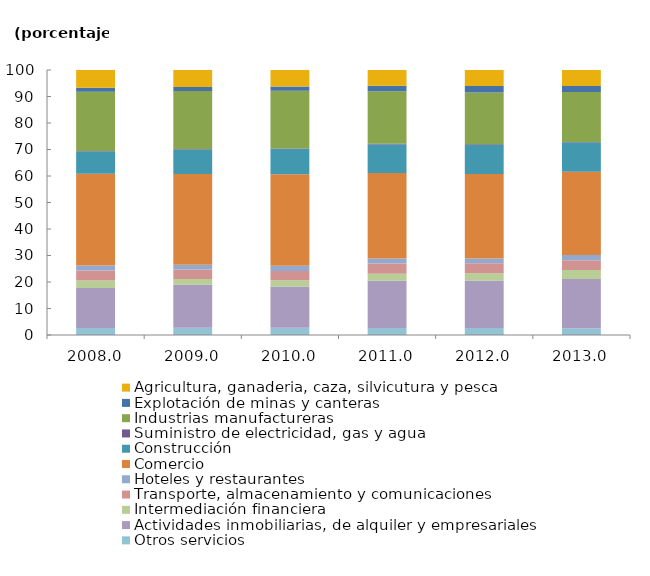
| Category | Otros servicios | Actividades inmobiliarias, de alquiler y empresariales | Intermediación financiera  | Transporte, almacenamiento y comunicaciones | Hoteles y restaurantes | Comercio | Construcción  | Suministro de electricidad, gas y agua | Industrias manufactureras | Explotación de minas y canteras | Agricultura, ganaderia, caza, silvicutura y pesca |
|---|---|---|---|---|---|---|---|---|---|---|---|
| 2008.0 | 2.598 | 15.096 | 2.875 | 3.735 | 1.951 | 34.557 | 8.429 | 0.196 | 22.347 | 1.559 | 6.656 |
| 2009.0 | 2.689 | 16.292 | 2.143 | 3.636 | 1.789 | 34.223 | 9.218 | 0.182 | 21.868 | 1.566 | 6.393 |
| 2010.0 | 2.694 | 15.582 | 2.373 | 3.528 | 1.914 | 34.602 | 9.521 | 0.208 | 21.746 | 1.577 | 6.254 |
| 2011.0 | 2.672 | 17.803 | 2.657 | 3.886 | 1.851 | 32.26 | 10.803 | 0.267 | 19.785 | 2.04 | 5.975 |
| 2012.0 | 2.672 | 17.863 | 2.731 | 3.794 | 1.796 | 31.854 | 10.984 | 0.256 | 19.561 | 2.411 | 6.077 |
| 2013.0 | 2.526 | 18.562 | 3.414 | 3.718 | 1.924 | 31.498 | 10.961 | 0.258 | 18.825 | 2.308 | 6.006 |